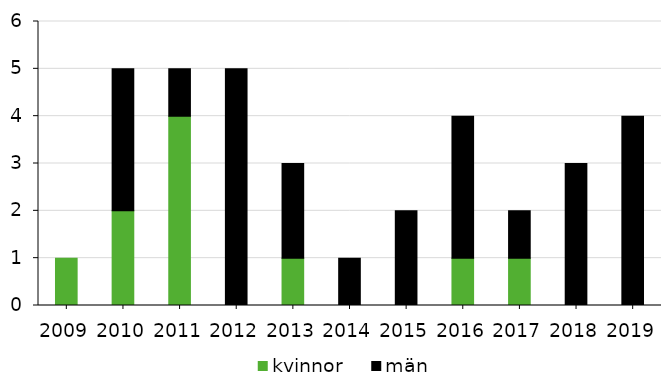
| Category | kvinnor | män |
|---|---|---|
| 2009 | 1 | 0 |
| 2010 | 2 | 3 |
| 2011 | 4 | 1 |
| 2012 | 0 | 5 |
| 2013 | 1 | 2 |
| 2014 | 0 | 1 |
| 2015 | 0 | 2 |
| 2016 | 1 | 3 |
| 2017 | 1 | 1 |
| 2018 | 0 | 3 |
| 2019 | 0 | 4 |